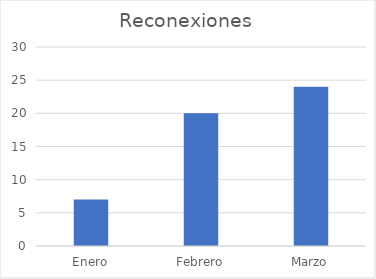
| Category | Reconexiones |
|---|---|
| Enero | 7 |
| Febrero | 20 |
| Marzo | 24 |